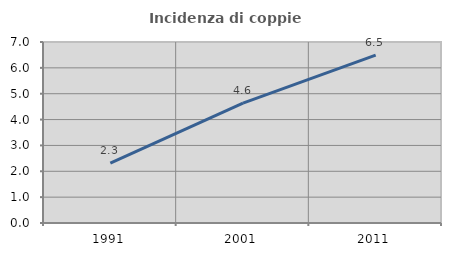
| Category | Incidenza di coppie miste |
|---|---|
| 1991.0 | 2.313 |
| 2001.0 | 4.639 |
| 2011.0 | 6.492 |